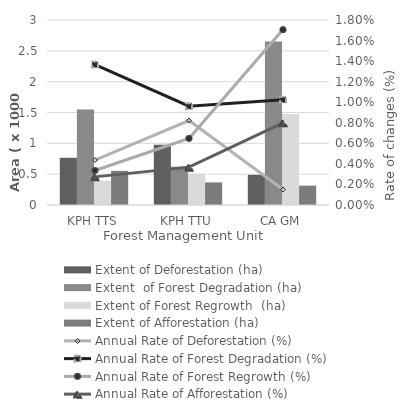
| Category | Extent of Deforestation (ha) | Extent  of Forest Degradation (ha) | Extent of Forest Regrowth  (ha) | Extent of Afforestation (ha) |
|---|---|---|---|---|
| KPH TTS | 765.36 | 1548.9 | 394.38 | 553.5 |
| KPH TTU | 976.77 | 621.18 | 507.6 | 366.75 |
| CA GM | 489.42 | 2650.14 | 1475.19 | 313.65 |